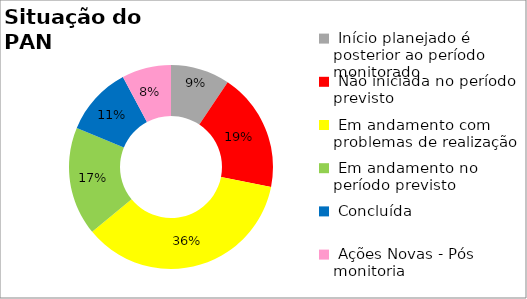
| Category | Series 0 |
|---|---|
|  Início planejado é posterior ao período monitorado | 0.094 |
|  Não iniciada no período previsto | 0.188 |
|  Em andamento com problemas de realização | 0.359 |
|  Em andamento no período previsto  | 0.172 |
|  Concluída | 0.109 |
|  Ações Novas - Pós monitoria | 0.078 |